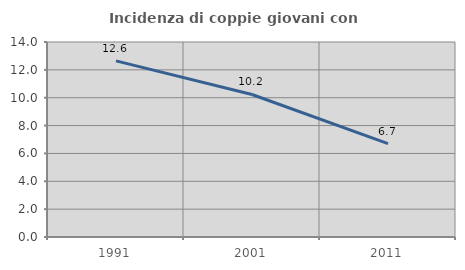
| Category | Incidenza di coppie giovani con figli |
|---|---|
| 1991.0 | 12.644 |
| 2001.0 | 10.233 |
| 2011.0 | 6.704 |